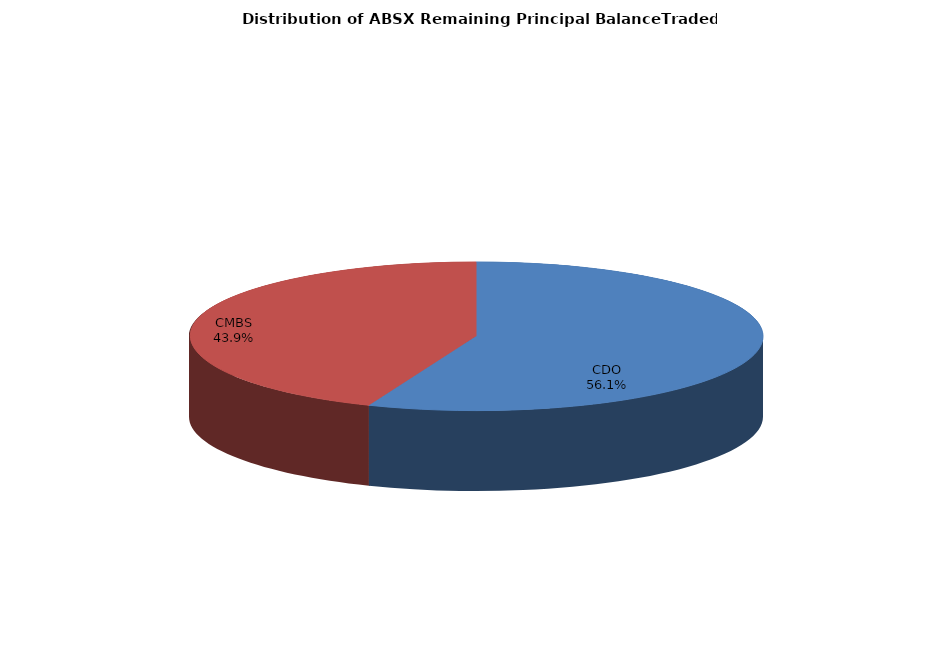
| Category | Series 0 |
|---|---|
| CDO | 1840114901.871 |
| CMBS | 1440971896.562 |